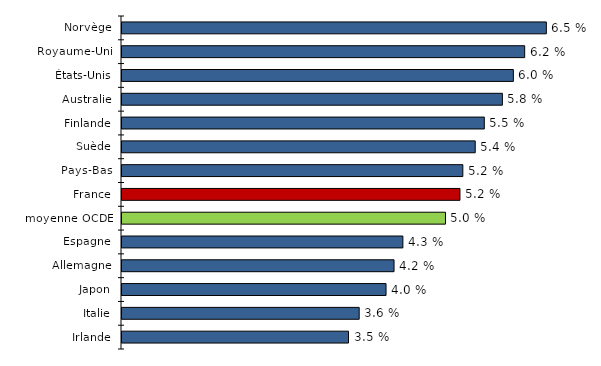
| Category | Series 0 |
|---|---|
| Irlande | 3.47 |
| Italie | 3.633 |
| Japon | 4.044 |
| Allemagne | 4.167 |
| Espagne | 4.302 |
| moyenne OCDE | 4.955 |
| France | 5.177 |
| Pays-Bas | 5.221 |
| Suède | 5.41 |
| Finlande | 5.549 |
| Australie | 5.826 |
| États-Unis | 5.995 |
| Royaume-Uni | 6.168 |
| Norvège | 6.5 |